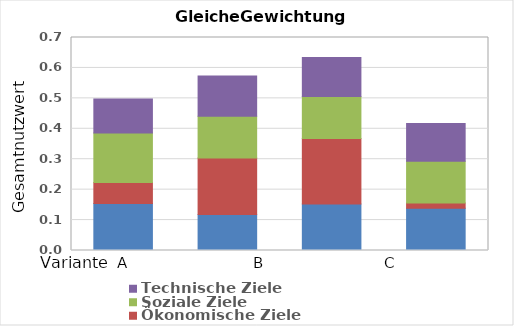
| Category | Umwelt- und Ressourcenschutz | Ökonomische Ziele | Soziale Ziele | Technische Ziele |
|---|---|---|---|---|
| 0 | 0.154 | 0.069 | 0.162 | 0.113 |
| 1 | 0.119 | 0.185 | 0.138 | 0.132 |
| 2 | 0.153 | 0.216 | 0.138 | 0.129 |
| 3 | 0.139 | 0.017 | 0.138 | 0.124 |